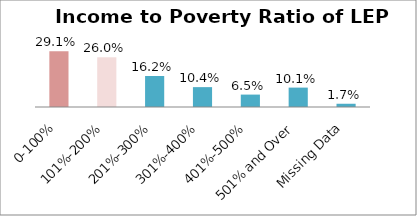
| Category | Percent |
|---|---|
| 0-100% | 0.291 |
| 101%-200% | 0.26 |
| 201%-300% | 0.162 |
| 301%-400% | 0.104 |
| 401%-500% | 0.065 |
| 501% and Over | 0.101 |
| Missing Data | 0.017 |